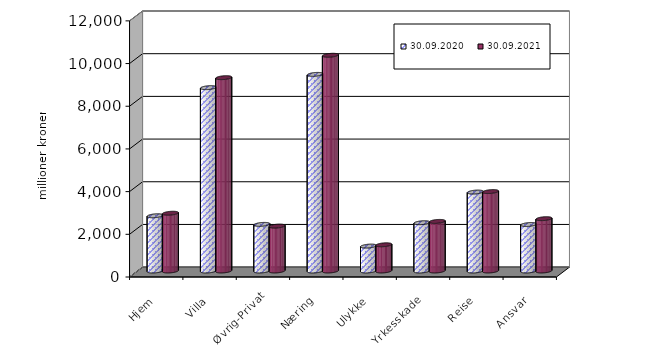
| Category | 30.09.2020 | 30.09.2021 |
|---|---|---|
| Hjem | 2587.95 | 2706.305 |
| Villa | 8591.116 | 9058.259 |
| Øvrig-Privat | 2184.155 | 2103.235 |
| Næring | 9211.718 | 10106.597 |
| Ulykke | 1167.267 | 1228.393 |
| Yrkesskade | 2262.805 | 2323.477 |
| Reise | 3698.428 | 3721.378 |
| Ansvar | 2177.929 | 2451.831 |